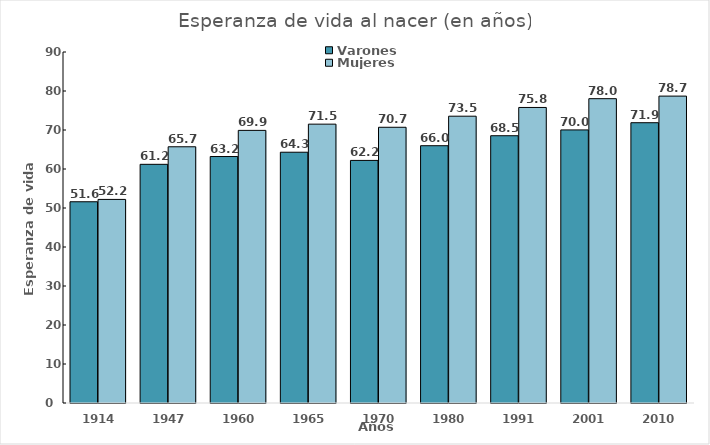
| Category | Varones | Mujeres |
|---|---|---|
| 1914.0 | 51.6 | 52.2 |
| 1947.0 | 61.2 | 65.7 |
| 1960.0 | 63.2 | 69.9 |
| 1965.0 | 64.3 | 71.5 |
| 1970.0 | 62.2 | 70.7 |
| 1980.0 | 65.97 | 73.54 |
| 1991.0 | 68.53 | 75.78 |
| 2001.0 | 70.021 | 78.029 |
| 2010.0 | 71.869 | 78.694 |